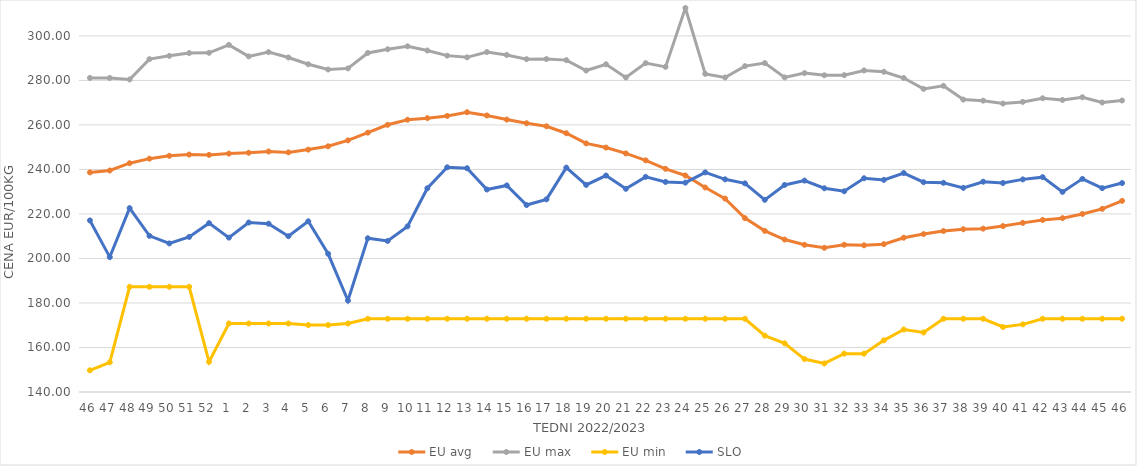
| Category | EU avg | EU max | EU min | SLO |
|---|---|---|---|---|
| 46.0 | 238.669 | 281.133 | 149.75 | 217.08 |
| 47.0 | 239.534 | 281.102 | 153.36 | 200.62 |
| 48.0 | 242.81 | 280.434 | 187.26 | 222.61 |
| 49.0 | 244.854 | 289.585 | 187.26 | 210.16 |
| 50.0 | 246.132 | 291.057 | 187.26 | 206.76 |
| 51.0 | 246.705 | 292.307 | 187.26 | 209.69 |
| 52.0 | 246.546 | 292.426 | 153.54 | 215.87 |
| 1.0 | 247.118 | 295.98 | 170.79 | 209.37 |
| 2.0 | 247.516 | 290.8 | 170.79 | 216.15 |
| 3.0 | 248.079 | 292.71 | 170.79 | 215.63 |
| 4.0 | 247.672 | 290.32 | 170.79 | 210 |
| 5.0 | 248.924 | 287.27 | 170.09 | 216.7 |
| 6.0 | 250.4 | 284.92 | 170.09 | 202.1 |
| 7.0 | 253.074 | 285.42 | 170.79 | 181.11 |
| 8.0 | 256.543 | 292.35 | 172.91 | 209.08 |
| 9.0 | 260.066 | 294.02 | 172.91 | 207.87 |
| 10.0 | 262.352 | 295.33 | 172.91 | 214.42 |
| 11.0 | 263.049 | 293.44 | 172.91 | 231.56 |
| 12.0 | 264.068 | 291.15 | 172.91 | 240.97 |
| 13.0 | 265.73 | 290.38 | 172.91 | 240.55 |
| 14.0 | 264.262 | 292.763 | 172.91 | 230.99 |
| 15.0 | 262.411 | 291.46 | 172.91 | 232.82 |
| 16.0 | 260.77 | 289.56 | 172.91 | 224 |
| 17.0 | 259.395 | 289.61 | 172.91 | 226.57 |
| 18.0 | 256.275 | 289.13 | 172.91 | 240.83 |
| 19.0 | 251.716 | 284.45 | 172.91 | 233.05 |
| 20.0 | 249.836 | 287.26 | 172.91 | 237.25 |
| 21.0 | 247.212 | 281.33 | 172.91 | 231.3 |
| 22.0 | 244.103 | 287.77 | 172.91 | 236.67 |
| 23.0 | 240.279 | 286.1 | 172.91 | 234.39 |
| 24.0 | 237.289 | 312.54 | 172.91 | 234.08 |
| 25.0 | 231.895 | 282.95 | 172.91 | 238.69 |
| 26.0 | 226.903 | 281.34 | 172.91 | 235.57 |
| 27.0 | 218.126 | 286.43 | 172.91 | 233.75 |
| 28.0 | 212.406 | 287.8 | 165.32 | 226.35 |
| 29.0 | 208.504 | 281.37 | 161.87 | 233.03 |
| 30.0 | 206.149 | 283.3 | 154.8 | 235 |
| 31.0 | 204.79 | 282.32 | 152.83 | 231.55 |
| 32.0 | 206.16 | 282.36 | 157.23 | 230.2 |
| 33.0 | 205.917 | 284.5 | 157.23 | 236.04 |
| 34.0 | 206.436 | 283.9 | 163.21 | 235.32 |
| 35.0 | 209.326 | 281.09 | 168.085 | 238.39 |
| 36.0 | 210.957 | 276.21 | 166.745 | 234.27 |
| 37.0 | 212.325 | 277.59 | 172.91 | 234 |
| 38.0 | 213.132 | 271.4 | 172.91 | 231.74 |
| 39.0 | 213.398 | 270.91 | 172.91 | 234.5 |
| 40.0 | 214.545 | 269.62 | 169.209 | 233.92 |
| 41.0 | 215.989 | 270.36 | 170.387 | 235.54 |
| 42.0 | 217.307 | 271.99 | 172.91 | 236.54 |
| 43.0 | 218.117 | 271.22 | 172.91 | 229.92 |
| 44.0 | 219.996 | 272.45 | 172.91 | 235.77 |
| 45.0 | 222.29 | 270.09 | 172.91 | 231.6 |
| 46.0 | 225.882 | 270.99 | 172.91 | 233.89 |